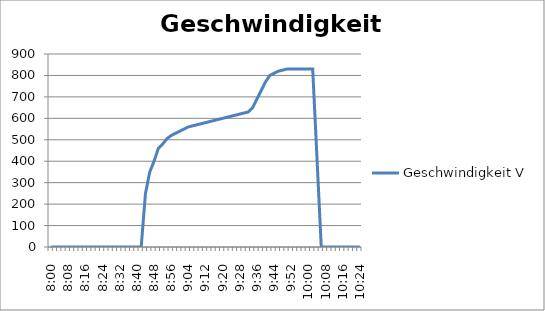
| Category | Geschwindigkeit V |
|---|---|
| 0.3333333333333333 | 0 |
| 0.3347222222222222 | 0 |
| 0.3361111111111111 | 0 |
| 0.3375 | 0 |
| 0.338888888888889 | 0 |
| 0.340277777777778 | 0 |
| 0.341666666666667 | 0 |
| 0.343055555555556 | 0 |
| 0.344444444444444 | 0 |
| 0.345833333333333 | 0 |
| 0.347222222222222 | 0 |
| 0.348611111111111 | 0 |
| 0.35 | 0 |
| 0.351388888888889 | 0 |
| 0.352777777777778 | 0 |
| 0.354166666666667 | 0 |
| 0.355555555555556 | 0 |
| 0.356944444444444 | 0 |
| 0.358333333333333 | 0 |
| 0.359722222222222 | 0 |
| 0.361111111111111 | 0 |
| 0.3625 | 0 |
| 0.363888888888889 | 250 |
| 0.365277777777778 | 350 |
| 0.366666666666666 | 400 |
| 0.368055555555555 | 460 |
| 0.369444444444444 | 480 |
| 0.370833333333333 | 505 |
| 0.372222222222222 | 520 |
| 0.373611111111111 | 530 |
| 0.375 | 540 |
| 0.376388888888889 | 550 |
| 0.377777777777778 | 560 |
| 0.379166666666666 | 565 |
| 0.380555555555555 | 570 |
| 0.381944444444444 | 575 |
| 0.383333333333333 | 580 |
| 0.384722222222222 | 585 |
| 0.386111111111111 | 590 |
| 0.3875 | 595 |
| 0.388888888888889 | 600 |
| 0.390277777777778 | 605 |
| 0.391666666666667 | 610 |
| 0.393055555555556 | 615 |
| 0.394444444444445 | 620 |
| 0.395833333333334 | 625 |
| 0.397222222222223 | 630 |
| 0.398611111111112 | 650 |
| 0.400000000000001 | 690 |
| 0.40138888888889 | 730 |
| 0.402777777777779 | 770 |
| 0.404166666666668 | 800 |
| 0.405555555555557 | 810 |
| 0.406944444444446 | 820 |
| 0.408333333333335 | 825 |
| 0.409722222222224 | 830 |
| 0.411111111111113 | 830 |
| 0.412500000000002 | 830 |
| 0.413888888888891 | 830 |
| 0.41527777777778 | 830 |
| 0.416666666666669 | 830 |
| 0.418055555555558 | 830 |
| 0.41944444444444445 | 415 |
| 0.420833333333336 | 0 |
| 0.422222222222225 | 0 |
| 0.423611111111114 | 0 |
| 0.425000000000003 | 0 |
| 0.426388888888892 | 0 |
| 0.427777777777781 | 0 |
| 0.42916666666667 | 0 |
| 0.430555555555559 | 0 |
| 0.431944444444448 | 0 |
| 0.433333333333337 | 0 |